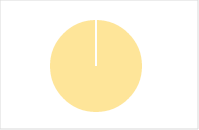
| Category | Total |
|---|---|
| Y | 0 |
| R | 0 |
| T | 0 |
| M | 0 |
| F | 0 |
| N | 44 |